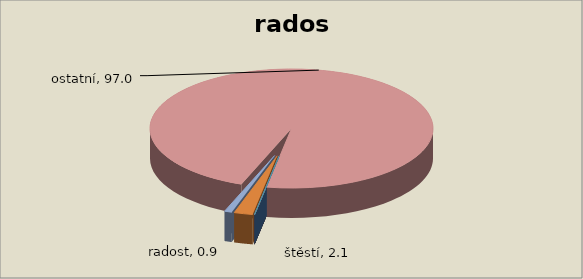
| Category | radost |
|---|---|
| Smutek | 0 |
| úzkost | 0 |
| zoufalství | 0 |
| zlost | 0 |
| naděje | 0 |
| štěstí | 2.128 |
| radost | 0.851 |
| ostatní | 97.021 |